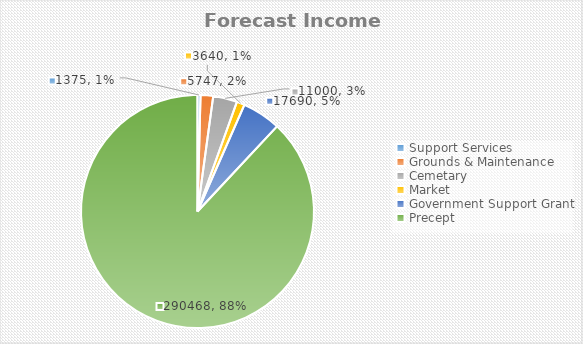
| Category | Series 0 |
|---|---|
| Support Services | 1375 |
| Grounds & Maintenance | 5747 |
| Cemetary | 11000 |
| Market   | 3640 |
| Government Support Grant | 17690 |
| Precept | 290468 |